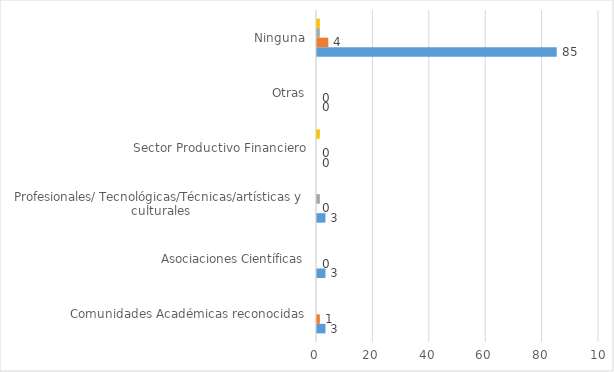
| Category | Series 0 | Series 1 | Series 2 | Series 3 |
|---|---|---|---|---|
| Comunidades Académicas reconocidas | 3 | 1 | 0 | 0 |
| Asociaciones Científicas | 3 | 0 | 0 | 0 |
| Profesionales/ Tecnológicas/Técnicas/artísticas y culturales | 3 | 0 | 1 | 0 |
| Sector Productivo Financiero | 0 | 0 | 0 | 1 |
| Otras | 0 | 0 | 0 | 0 |
| Ninguna | 85 | 4 | 1 | 1 |